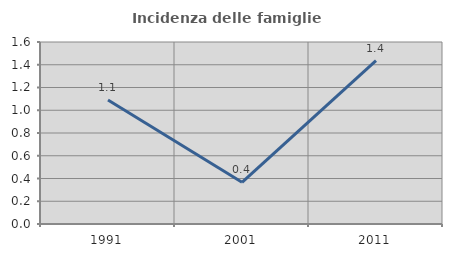
| Category | Incidenza delle famiglie numerose |
|---|---|
| 1991.0 | 1.09 |
| 2001.0 | 0.367 |
| 2011.0 | 1.436 |